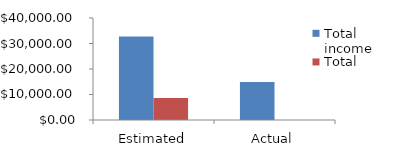
| Category | Total income | Total expenses |
|---|---|---|
| Estimated | 32750 | 8675 |
| Actual | 14910 | 0 |